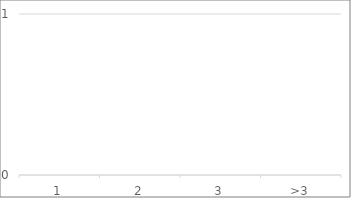
| Category | Series 0 | Series 1 |
|---|---|---|
| 1 | 0 | 0 |
| 2 | 0 | 0 |
| 3 | 0 | 0 |
| >3 | 0 | 0 |